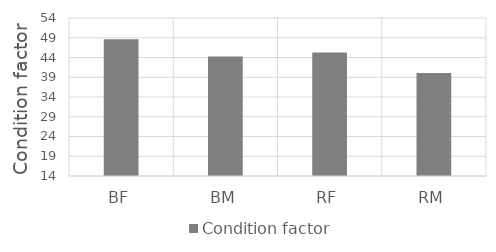
| Category | Condition factor |
|---|---|
| BF | 48.646 |
| BM | 44.222 |
| RF | 45.274 |
| RM | 40.083 |